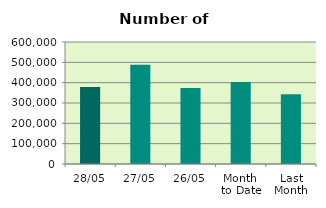
| Category | Series 0 |
|---|---|
| 28/05 | 378796 |
| 27/05 | 487604 |
| 26/05 | 373170 |
| Month 
to Date | 402832.556 |
| Last
Month | 343067.2 |